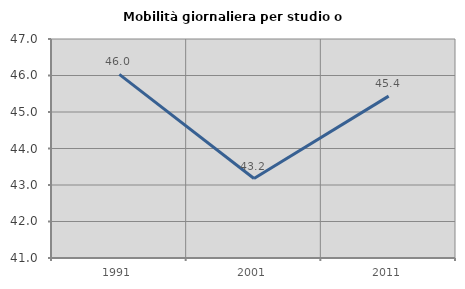
| Category | Mobilità giornaliera per studio o lavoro |
|---|---|
| 1991.0 | 46.032 |
| 2001.0 | 43.178 |
| 2011.0 | 45.435 |